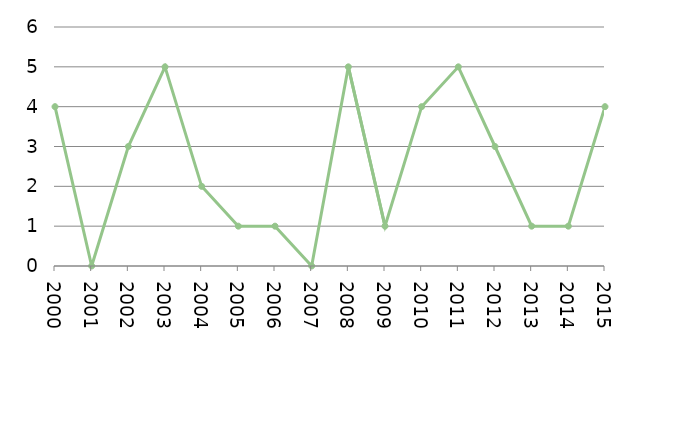
| Category | Avlidna |
|---|---|
| 2000.0 | 4 |
| 2001.0 | 0 |
| 2002.0 | 3 |
| 2003.0 | 5 |
| 2004.0 | 2 |
| 2005.0 | 1 |
| 2006.0 | 1 |
| 2007.0 | 0 |
| 2008.0 | 5 |
| 2009.0 | 1 |
| 2010.0 | 4 |
| 2011.0 | 5 |
| 2012.0 | 3 |
| 2013.0 | 1 |
| 2014.0 | 1 |
| 2015.0 | 4 |